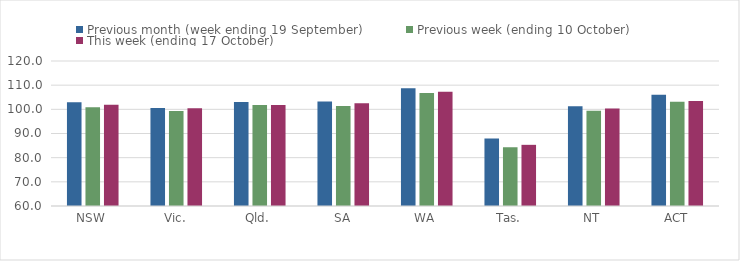
| Category | Previous month (week ending 19 September) | Previous week (ending 10 October) | This week (ending 17 October) |
|---|---|---|---|
| NSW | 102.88 | 100.82 | 101.93 |
| Vic. | 100.58 | 99.29 | 100.5 |
| Qld. | 103.05 | 101.8 | 101.82 |
| SA | 103.26 | 101.39 | 102.49 |
| WA | 108.69 | 106.78 | 107.32 |
| Tas. | 87.9 | 84.31 | 85.31 |
| NT | 101.29 | 99.45 | 100.31 |
| ACT | 106.04 | 103.14 | 103.48 |